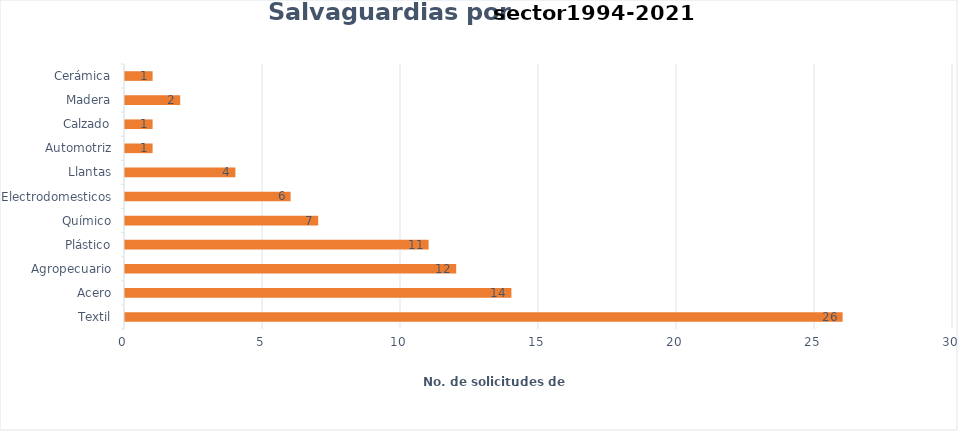
| Category | Series 0 |
|---|---|
| Textil | 26 |
| Acero | 14 |
| Agropecuario | 12 |
| Plástico | 11 |
| Químico | 7 |
| Electrodomesticos | 6 |
| Llantas | 4 |
| Automotriz | 1 |
| Calzado | 1 |
| Madera | 2 |
| Cerámica | 1 |